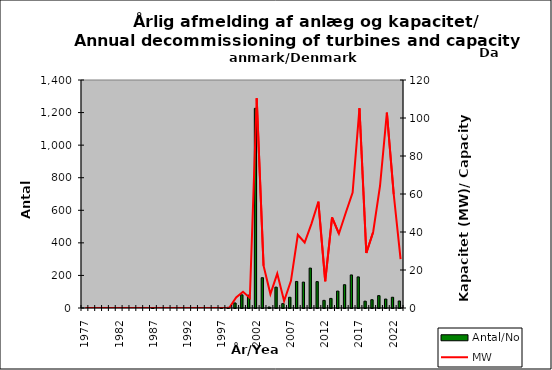
| Category | Antal/No |
|---|---|
| 1977.0 | 0 |
| 1978.0 | 0 |
| 1979.0 | 0 |
| 1980.0 | 0 |
| 1981.0 | 0 |
| 1982.0 | 0 |
| 1983.0 | 0 |
| 1984.0 | 0 |
| 1985.0 | 0 |
| 1986.0 | 0 |
| 1987.0 | 1 |
| 1988.0 | 0 |
| 1989.0 | 0 |
| 1990.0 | 0 |
| 1991.0 | 0 |
| 1992.0 | 0 |
| 1993.0 | 0 |
| 1994.0 | 0 |
| 1995.0 | 0 |
| 1996.0 | 0 |
| 1997.0 | 1 |
| 1998.0 | 4 |
| 1999.0 | 31 |
| 2000.0 | 81 |
| 2001.0 | 79 |
| 2002.0 | 1226 |
| 2003.0 | 186 |
| 2004.0 | 6 |
| 2005.0 | 128 |
| 2006.0 | 27 |
| 2007.0 | 66 |
| 2008.0 | 163 |
| 2009.0 | 159 |
| 2010.0 | 245 |
| 2011.0 | 162 |
| 2012.0 | 47 |
| 2013.0 | 59 |
| 2014.0 | 104 |
| 2015.0 | 143 |
| 2016.0 | 203 |
| 2017.0 | 191 |
| 2018.0 | 42 |
| 2019.0 | 51 |
| 2020.0 | 76 |
| 2021.0 | 55 |
| 2022.0 | 66 |
| 2023.0 | 43 |